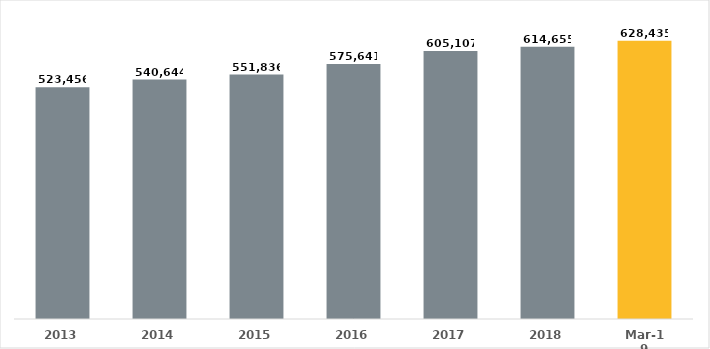
| Category | Series 0 |
|---|---|
| 2013.0 | 523456 |
| 2014.0 | 540644 |
| 2015.0 | 551836 |
| 2016.0 | 575641 |
| 2017.0 | 605107 |
| 2018.0 | 614655 |
| 43525.0 | 628435 |